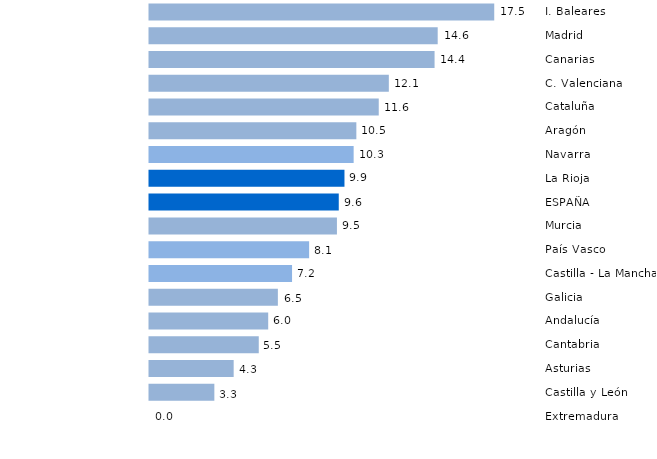
| Category | Series 0 |
|---|---|
| Extremadura | 0 |
| Castilla y León | 3.284 |
| Asturias  | 4.262 |
| Cantabria | 5.532 |
| Andalucía | 6.01 |
| Galicia | 6.5 |
| Castilla - La Mancha | 7.218 |
| País Vasco | 8.082 |
| Murcia | 9.49 |
| ESPAÑA | 9.583 |
| La Rioja | 9.872 |
| Navarra  | 10.336 |
| Aragón | 10.473 |
| Cataluña | 11.608 |
| C. Valenciana | 12.118 |
| Canarias | 14.434 |
| Madrid | 14.592 |
| I. Baleares | 17.455 |